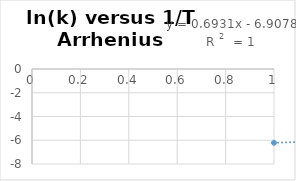
| Category | Series 0 |
|---|---|
| 0 | -6.215 |
| 1 | -5.521 |
| 2 | -4.828 |
| 3 | -4.135 |